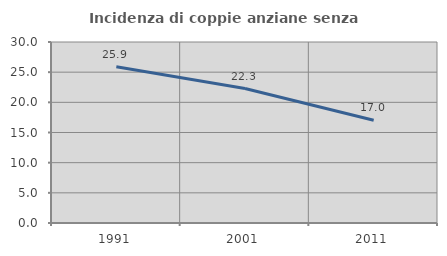
| Category | Incidenza di coppie anziane senza figli  |
|---|---|
| 1991.0 | 25.888 |
| 2001.0 | 22.289 |
| 2011.0 | 17.037 |